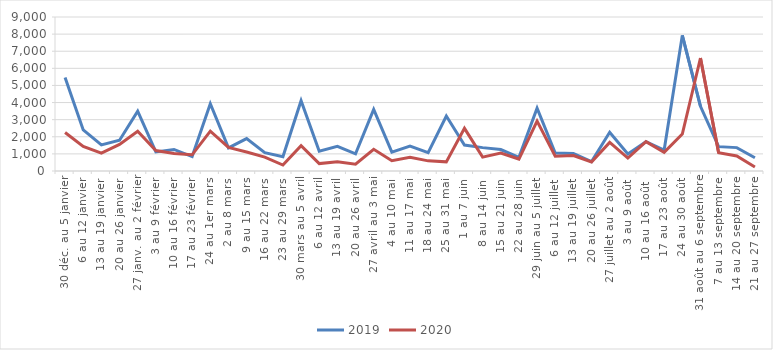
| Category | 2019 | 2020 |
|---|---|---|
| 30 déc. au 5 janvier | 5470 | 2248 |
| 6 au 12 janvier | 2400 | 1439 |
| 13 au 19 janvier | 1527 | 1046 |
| 20 au 26 janvier | 1798 | 1553 |
| 27 janv. au 2 février | 3495 | 2324 |
| 3 au 9 février | 1116 | 1196 |
| 10 au 16 février | 1260 | 1018 |
| 17 au 23 février | 841 | 946 |
| 24 au 1er mars | 3928 | 2329 |
| 2 au 8 mars | 1349 | 1378 |
| 9 au 15 mars | 1893 | 1110 |
| 16 au 22 mars | 1068 | 808 |
| 23 au 29 mars | 828 | 349 |
| 30 mars au 5 avril | 4105 | 1477 |
| 6 au 12 avril | 1156 | 433 |
| 13 au 19 avril | 1440 | 537 |
| 20 au 26 avril | 1002 | 396 |
| 27 avril au 3 mai | 3595 | 1267 |
| 4 au 10 mai | 1106 | 604 |
| 11 au 17 mai | 1456 | 798 |
| 18 au 24 mai | 1078 | 593 |
| 25 au 31 mai | 3215 | 534 |
| 1 au 7 juin | 1515 | 2493 |
| 8 au 14 juin | 1366 | 810 |
| 15 au 21 juin | 1252 | 1051 |
| 22 au 28 juin | 799 | 699 |
| 29 juin au 5 juillet | 3667 | 2922 |
| 6 au 12 juillet | 1051 | 862 |
| 13 au 19 juillet | 1024 | 904 |
| 20 au 26 juillet | 555 | 528 |
| 27 juillet au 2 août | 2260 | 1674 |
| 3 au 9 août | 993 | 754 |
| 10 au 16 août  | 1713 | 1716 |
| 17 au 23 août | 1221 | 1092 |
| 24 au 30 août | 7919 | 2159 |
| 31 août au 6 septembre | 3784 | 6604 |
| 7 au 13 septembre | 1424 | 1070 |
| 14 au 20 septembre | 1366 | 874 |
| 21 au 27 septembre | 775 | 229 |